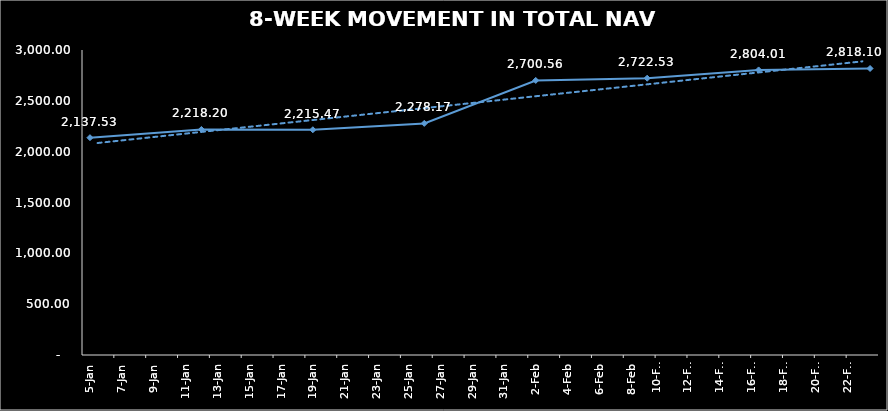
| Category | TOTAL NAV |
|---|---|
| 2024-01-05 | 2137.525 |
| 2024-01-12 | 2218.205 |
| 2024-01-19 | 2215.471 |
| 2024-01-26 | 2278.172 |
| 2024-02-02 | 2700.559 |
| 2024-02-09 | 2722.532 |
| 2024-02-16 | 2804.014 |
| 2024-02-23 | 2818.099 |